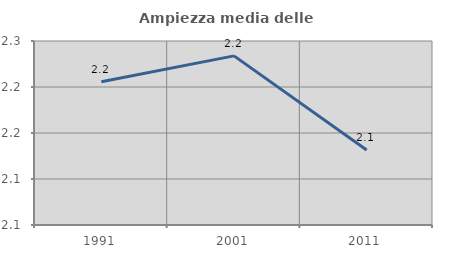
| Category | Ampiezza media delle famiglie |
|---|---|
| 1991.0 | 2.206 |
| 2001.0 | 2.234 |
| 2011.0 | 2.131 |